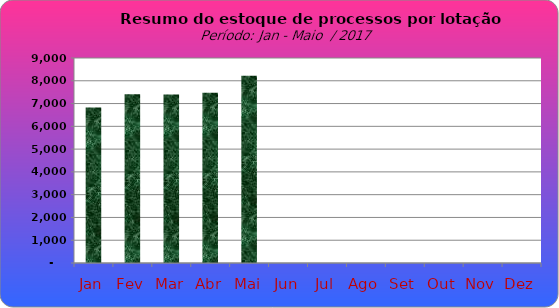
| Category | Series 0 |
|---|---|
| Jan | 6829 |
| Fev | 7414 |
| Mar | 7401 |
| Abr | 7477 |
| Mai | 8225 |
| Jun | 0 |
| Jul | 0 |
| Ago | 0 |
| Set | 0 |
| Out | 0 |
| Nov | 0 |
| Dez | 0 |